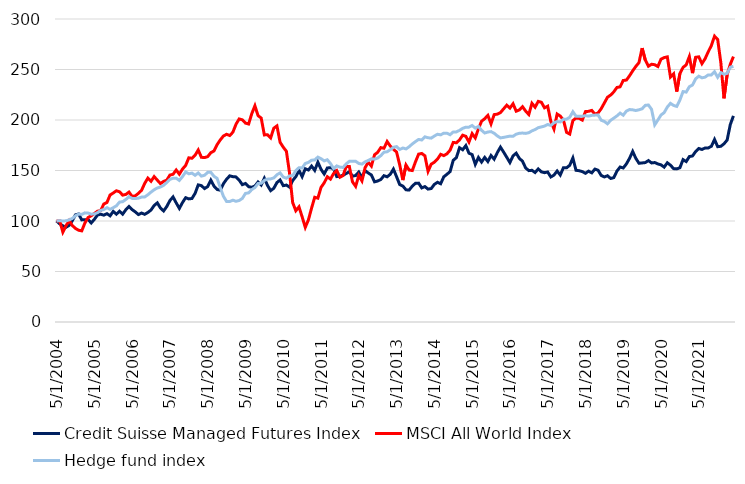
| Category | Credit Suisse Managed Futures Index | MSCI All World Index | Hedge fund index |
|---|---|---|---|
| 5/31/04 | 100 | 100 | 100 |
| 6/30/04 | 97.164 | 100.06 | 100.343 |
| 7/31/04 | 95.27 | 88.94 | 100.031 |
| 8/31/04 | 93.808 | 95.37 | 100.166 |
| 9/30/04 | 95.652 | 100.44 | 101.182 |
| 10/31/04 | 100.265 | 95.53 | 102.48 |
| 11/30/04 | 106.11 | 92.64 | 105.196 |
| 12/31/04 | 106.879 | 90.88 | 106.884 |
| 1/31/05 | 101.115 | 90.22 | 106.524 |
| 2/28/05 | 101.192 | 98.01 | 108.05 |
| 3/31/05 | 101.568 | 103.41 | 107.883 |
| 4/30/05 | 98.065 | 105.18 | 106.765 |
| 5/31/05 | 101.619 | 107.37 | 106.922 |
| 6/30/05 | 105.907 | 109.7 | 108.318 |
| 7/31/05 | 106.732 | 110.22 | 110.401 |
| 8/31/05 | 105.8 | 116.78 | 111.376 |
| 9/30/05 | 107.256 | 118.37 | 113.188 |
| 10/31/05 | 105.148 | 125.73 | 111.54 |
| 11/30/05 | 109.532 | 127.77 | 113.191 |
| 12/31/05 | 106.757 | 129.93 | 115.016 |
| 1/31/06 | 109.654 | 128.89 | 118.726 |
| 2/28/06 | 106.782 | 125.63 | 119.127 |
| 3/31/06 | 111.141 | 126.31 | 121.299 |
| 4/30/06 | 114.385 | 128.62 | 123.986 |
| 5/31/06 | 111.294 | 124.39 | 122.376 |
| 6/30/06 | 109.028 | 124.92 | 122.247 |
| 7/31/06 | 106.38 | 127.36 | 122.597 |
| 8/31/06 | 107.857 | 130.37 | 123.643 |
| 9/30/06 | 106.614 | 137.27 | 123.803 |
| 10/31/06 | 108.458 | 142.45 | 125.995 |
| 11/30/06 | 110.866 | 139.34 | 128.604 |
| 12/31/06 | 115.352 | 143.94 | 130.963 |
| 1/31/07 | 117.964 | 140.44 | 132.702 |
| 2/28/07 | 112.801 | 137.04 | 133.684 |
| 3/31/07 | 109.934 | 139.22 | 135.336 |
| 4/30/07 | 114.349 | 140.41 | 138.071 |
| 5/31/07 | 120.22 | 145.48 | 141.259 |
| 6/30/07 | 123.861 | 146.3 | 142.36 |
| 7/31/07 | 117.929 | 150.5 | 142.353 |
| 8/31/07 | 112.496 | 146.36 | 140.175 |
| 9/30/07 | 118.27 | 151.42 | 143.967 |
| 10/31/07 | 123.066 | 155.02 | 148.52 |
| 11/30/07 | 121.895 | 162.55 | 146.729 |
| 12/31/07 | 122.287 | 162.09 | 147.412 |
| 1/31/08 | 127.338 | 165.12 | 145.231 |
| 2/29/08 | 135.755 | 170.32 | 147.562 |
| 3/31/08 | 135.032 | 163.09 | 144.449 |
| 4/30/08 | 132.13 | 162.77 | 145.275 |
| 5/31/08 | 134.029 | 163.74 | 148.177 |
| 6/30/08 | 140.455 | 167.63 | 148.17 |
| 7/31/08 | 134.554 | 169.37 | 144.307 |
| 8/31/08 | 131.218 | 175.61 | 142.183 |
| 9/30/08 | 130.475 | 180.26 | 132.869 |
| 10/31/08 | 136.952 | 184.14 | 124.5 |
| 11/30/08 | 141.356 | 185.85 | 119.338 |
| 12/31/08 | 144.707 | 184.64 | 119.297 |
| 1/31/09 | 143.902 | 187.9 | 120.602 |
| 2/28/09 | 143.668 | 195.83 | 119.535 |
| 3/31/09 | 140.537 | 201.03 | 120.317 |
| 4/30/09 | 135.979 | 200.17 | 122.342 |
| 5/31/09 | 137.14 | 196.94 | 127.31 |
| 6/30/09 | 133.958 | 196.01 | 127.857 |
| 7/31/09 | 133.388 | 206.24 | 131.102 |
| 8/31/09 | 134.62 | 214.1 | 133.103 |
| 9/30/09 | 138.622 | 204.33 | 137.15 |
| 10/31/09 | 135.613 | 201.9 | 137.324 |
| 11/30/09 | 142.319 | 185.22 | 140.215 |
| 12/31/09 | 135.2 | 185.46 | 141.452 |
| 1/31/10 | 130.052 | 182.24 | 141.69 |
| 2/28/10 | 132.405 | 191.91 | 142.655 |
| 3/31/10 | 138.032 | 194.14 | 145.822 |
| 4/30/10 | 140.644 | 177.94 | 147.63 |
| 5/31/10 | 134.981 | 173.11 | 143.549 |
| 6/30/10 | 135.552 | 169.03 | 142.339 |
| 7/31/10 | 133.525 | 147.59 | 144.599 |
| 8/31/10 | 140.028 | 118.21 | 144.939 |
| 9/30/10 | 143.908 | 110.17 | 149.913 |
| 10/31/10 | 150.079 | 113.99 | 152.795 |
| 11/30/10 | 143.913 | 104.15 | 152.513 |
| 12/31/10 | 151.718 | 93.71 | 156.94 |
| 1/31/11 | 150.481 | 101.16 | 158.021 |
| 2/28/11 | 154.387 | 112.77 | 160.206 |
| 3/31/11 | 150.12 | 123.51 | 160.403 |
| 4/30/11 | 158.231 | 122.62 | 163.295 |
| 5/31/11 | 151.204 | 133.25 | 161.732 |
| 6/30/11 | 146.555 | 137.74 | 159.53 |
| 7/31/11 | 152.462 | 143.81 | 160.627 |
| 8/31/11 | 152.839 | 141.49 | 156.934 |
| 9/30/11 | 151.642 | 147.03 | 151.911 |
| 10/31/11 | 143.964 | 149.92 | 154.538 |
| 11/30/11 | 144.218 | 143.36 | 153.322 |
| 12/31/11 | 145.359 | 144.95 | 152.989 |
| 1/31/12 | 147.024 | 153.91 | 156.563 |
| 2/29/12 | 148.796 | 153.88 | 159.085 |
| 3/31/12 | 144.386 | 138.77 | 159.163 |
| 4/30/12 | 145.012 | 134.31 | 159.102 |
| 5/31/12 | 148.47 | 145.07 | 156.985 |
| 6/30/12 | 143.184 | 139.72 | 156.356 |
| 7/31/12 | 149.89 | 152.79 | 158.578 |
| 8/31/12 | 147.564 | 158.19 | 159.91 |
| 9/30/12 | 145.537 | 154.4 | 161.575 |
| 10/31/12 | 138.785 | 165.54 | 161.286 |
| 11/30/12 | 139.595 | 168.02 | 162.323 |
| 12/31/12 | 141.102 | 172.64 | 164.729 |
| 1/31/13 | 144.875 | 172.05 | 168.134 |
| 2/28/13 | 143.76 | 178.69 | 168.534 |
| 3/31/13 | 146.26 | 174.19 | 170.577 |
| 4/30/13 | 151.382 | 171.14 | 172.942 |
| 5/31/13 | 143.841 | 168.18 | 173.665 |
| 6/30/13 | 136.04 | 155.52 | 170.791 |
| 7/31/13 | 134.594 | 140.51 | 172.296 |
| 8/31/13 | 130.862 | 155.41 | 171.362 |
| 9/30/13 | 130.669 | 150.43 | 173.543 |
| 10/31/13 | 134.533 | 149.96 | 176.309 |
| 11/30/13 | 137.349 | 158.54 | 178.616 |
| 12/31/13 | 137.492 | 166.19 | 180.75 |
| 1/31/14 | 132.787 | 166.88 | 180.234 |
| 2/28/14 | 134.029 | 164.56 | 183.326 |
| 3/31/14 | 131.59 | 149.19 | 182.439 |
| 4/30/14 | 132.145 | 156.27 | 182.062 |
| 5/31/14 | 136.229 | 158.22 | 184.121 |
| 6/30/14 | 138.322 | 161.29 | 185.885 |
| 7/31/14 | 136.901 | 166.01 | 185.31 |
| 8/31/14 | 143.775 | 164.76 | 186.938 |
| 9/30/14 | 146.255 | 166.54 | 186.918 |
| 10/31/14 | 148.903 | 170.1 | 185.422 |
| 11/30/14 | 160.074 | 177.79 | 188.199 |
| 12/31/14 | 162.742 | 177.45 | 188.222 |
| 1/31/15 | 172.544 | 180.27 | 189.741 |
| 2/28/15 | 170.554 | 184.96 | 191.746 |
| 3/31/15 | 174.647 | 183.84 | 192.895 |
| 4/30/15 | 167.157 | 178.15 | 192.936 |
| 5/31/15 | 165.747 | 186.5 | 194.529 |
| 6/30/15 | 156.118 | 182.24 | 191.974 |
| 7/31/15 | 162.88 | 191.29 | 193.649 |
| 8/31/15 | 158.389 | 198.82 | 189.799 |
| 9/30/15 | 162.936 | 201.3 | 187.125 |
| 10/31/15 | 158.898 | 204.55 | 188.11 |
| 11/30/15 | 164.83 | 196.22 | 188.494 |
| 12/31/15 | 161.225 | 205.34 | 186.894 |
| 1/31/16 | 167.707 | 205.79 | 184.257 |
| 2/29/16 | 173.13 | 207.32 | 182.259 |
| 3/31/16 | 168.232 | 211.05 | 182.779 |
| 4/30/16 | 163.109 | 214.66 | 183.397 |
| 5/31/16 | 157.895 | 211.81 | 184.053 |
| 6/30/16 | 164.504 | 216.07 | 183.866 |
| 7/31/16 | 167.147 | 208.71 | 185.973 |
| 8/31/16 | 161.984 | 210.01 | 186.84 |
| 9/30/16 | 159.193 | 213.2 | 187.071 |
| 10/31/16 | 152.548 | 208.84 | 186.738 |
| 11/30/16 | 149.896 | 205.44 | 187.417 |
| 12/31/16 | 150.196 | 216.53 | 189.222 |
| 1/31/17 | 148.017 | 212.67 | 190.547 |
| 2/28/17 | 151.556 | 218.44 | 192.388 |
| 3/31/17 | 148.663 | 217.55 | 193.146 |
| 4/30/17 | 147.854 | 212.04 | 193.979 |
| 5/31/17 | 148.495 | 213.68 | 195.566 |
| 6/30/17 | 143.612 | 198.63 | 194.611 |
| 7/31/17 | 145.461 | 191.08 | 197.268 |
| 8/31/17 | 149.488 | 205.9 | 198.427 |
| 9/30/17 | 145.512 | 203.88 | 198.124 |
| 10/31/17 | 152.778 | 199.95 | 200.663 |
| 11/30/17 | 152.635 | 187.76 | 200.863 |
| 12/31/17 | 155.14 | 186.08 | 202.688 |
| 1/31/18 | 162.371 | 199.4 | 208.186 |
| 2/28/18 | 150.196 | 201.94 | 203.765 |
| 3/31/18 | 149.794 | 201.56 | 203.636 |
| 4/30/18 | 148.892 | 199.91 | 203.741 |
| 5/31/18 | 147.253 | 208.33 | 204.302 |
| 6/30/18 | 149.356 | 208.59 | 203.833 |
| 7/31/18 | 147.676 | 209.5 | 204.567 |
| 8/31/18 | 151.372 | 205.78 | 204.822 |
| 9/30/18 | 150.298 | 206.99 | 205.032 |
| 10/31/18 | 145.074 | 211.21 | 199.759 |
| 11/30/18 | 143.638 | 216.86 | 198.586 |
| 12/31/18 | 144.794 | 222.55 | 196.221 |
| 1/31/19 | 142.125 | 224.74 | 199.694 |
| 2/28/19 | 142.91 | 227.89 | 201.848 |
| 3/31/19 | 149.442 | 232.21 | 204.05 |
| 4/30/19 | 153.445 | 232.86 | 206.823 |
| 5/31/19 | 152.508 | 239.11 | 204.754 |
| 6/30/19 | 156.51 | 239.53 | 208.845 |
| 7/31/19 | 162.035 | 243.77 | 210.347 |
| 8/31/19 | 168.848 | 248.65 | 210.058 |
| 9/30/19 | 162.03 | 253.06 | 209.392 |
| 10/31/19 | 157.162 | 256.86 | 210.109 |
| 11/30/19 | 157.493 | 271.2 | 211.091 |
| 12/31/19 | 157.839 | 259.39 | 214.496 |
| 1/31/20 | 159.815 | 253.25 | 214.842 |
| 2/29/20 | 157.467 | 255.19 | 210.564 |
| 3/31/20 | 157.89 | 254.73 | 195.229 |
| 4/30/20 | 156.5 | 252.94 | 199.969 |
| 5/31/20 | 155.588 | 260.26 | 204.941 |
| 6/30/20 | 153.328 | 261.79 | 207.326 |
| 7/31/20 | 157.666 | 262.48 | 212.797 |
| 8/31/20 | 155.242 | 242.61 | 216.463 |
| 9/30/20 | 151.846 | 245.76 | 214.448 |
| 10/31/20 | 151.612 | 228.14 | 213.449 |
| 11/30/20 | 152.722 | 245.93 | 219.831 |
| 12/31/20 | 160.777 | 252.08 | 228.142 |
| 1/31/21 | 158.852 | 254.62 | 227.629 |
| 2/28/21 | 163.802 | 262.77 | 232.944 |
| 3/31/21 | 164.387 | 246.39 | 234.653 |
| 4/30/21 | 168.802 | 262.07 | 240.735 |
| 5/31/21 | 171.776 | 262.53 | 243.386 |
| 6/30/21 | 170.818 | 255.79 | 241.744 |
| 7/31/21 | 172.29 | 260.68 | 242.431 |
| 8/31/21 | 172.366 | 267.57 | 244.67 |
| 9/30/21 | 173.98 | 273.72 | 244.626 |
| 10/31/21 | 180.722 | 283 | 247.752 |
| 11/30/21 | 173.588 | 279.69 | 242.278 |
| 12/31/21 | 173.945 | 256.73 | 246.92 |
| 1/31/22 | 176.424 | 221.47 | 245.299 |
| 2/28/22 | 180.121 | 244.92 | 246.196 |
| 3/31/22 | 195.417 | 255.08 | 252.19 |
| 4/30/22 | 204.074 | 262.81 | 253.162 |